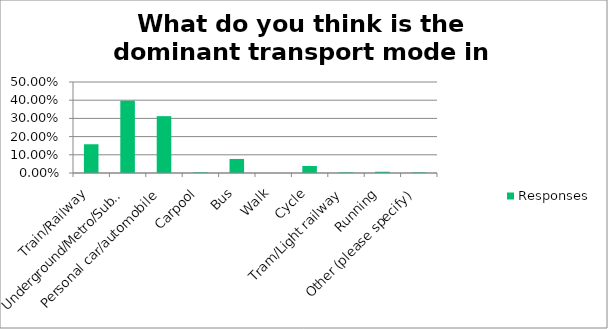
| Category | Responses |
|---|---|
| Train/Railway | 0.158 |
| Underground/Metro/Subway | 0.396 |
| Personal car/automobile | 0.312 |
| Carpool | 0.004 |
| Bus | 0.077 |
| Walk | 0 |
| Cycle | 0.039 |
| Tram/Light railway | 0.004 |
| Running | 0.007 |
| Other (please specify) | 0.004 |